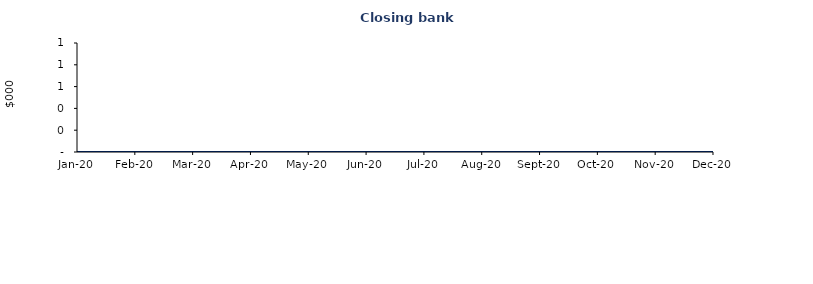
| Category | Series 0 |
|---|---|
| 2020-01-01 | 0 |
| 2020-02-01 | 0 |
| 2020-03-01 | 0 |
| 2020-04-01 | 0 |
| 2020-05-01 | 0 |
| 2020-06-01 | 0 |
| 2020-07-01 | 0 |
| 2020-08-01 | 0 |
| 2020-09-01 | 0 |
| 2020-10-01 | 0 |
| 2020-11-01 | 0 |
| 2020-12-01 | 0 |